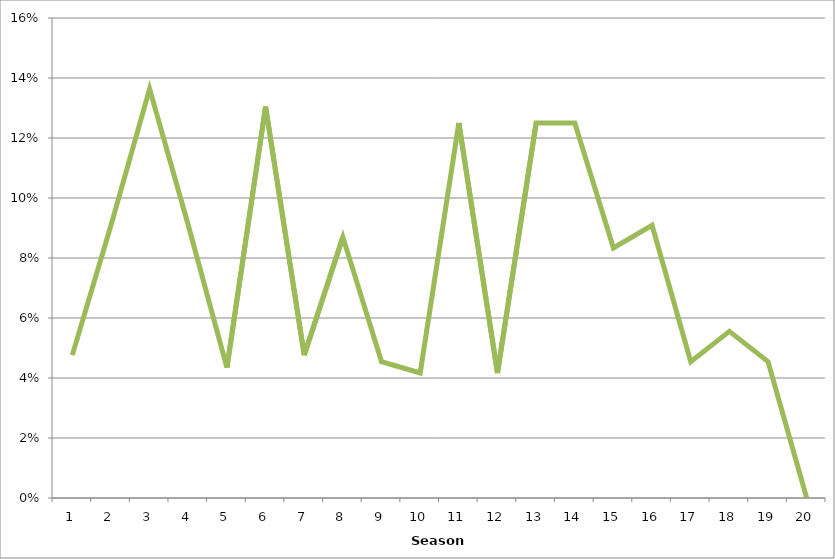
| Category | Series 2 |
|---|---|
| 0 | 0.048 |
| 1 | 0.091 |
| 2 | 0.136 |
| 3 | 0.091 |
| 4 | 0.043 |
| 5 | 0.13 |
| 6 | 0.048 |
| 7 | 0.087 |
| 8 | 0.045 |
| 9 | 0.042 |
| 10 | 0.125 |
| 11 | 0.042 |
| 12 | 0.125 |
| 13 | 0.125 |
| 14 | 0.083 |
| 15 | 0.091 |
| 16 | 0.045 |
| 17 | 0.056 |
| 18 | 0.045 |
| 19 | 0 |